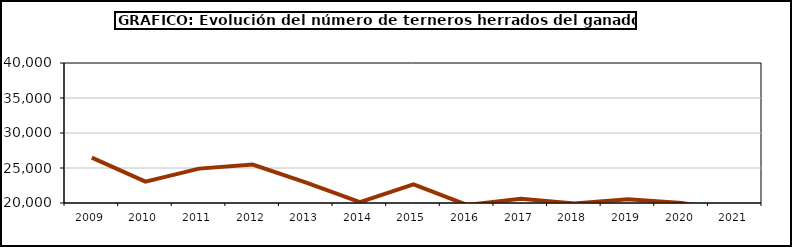
| Category | Ganado de Lidia |
|---|---|
| 2009.0 | 26477 |
| 2010.0 | 23052 |
| 2011.0 | 24912 |
| 2012.0 | 25485 |
| 2013.0 | 22909 |
| 2014.0 | 20127 |
| 2015.0 | 22647 |
| 2016.0 | 19726 |
| 2017.0 | 20623 |
| 2018.0 | 19942 |
| 2019.0 | 20534 |
| 2020.0 | 20001 |
| 2021.0 | 18786 |